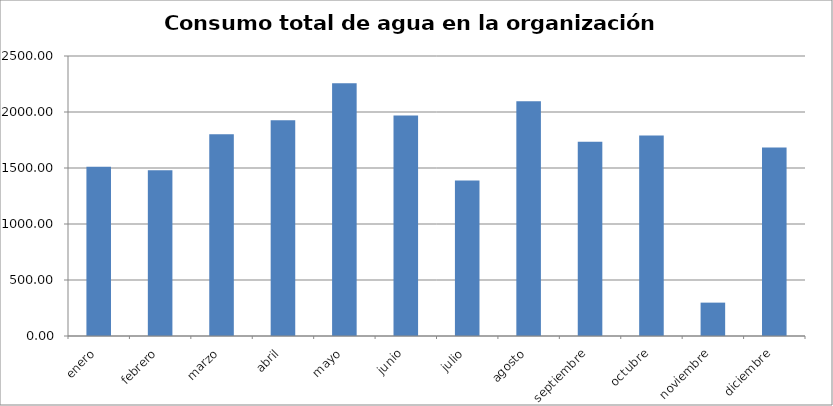
| Category | Series 0 |
|---|---|
| enero | 1511 |
| febrero | 1480 |
| marzo | 1802 |
| abril | 1926 |
| mayo | 2256 |
| junio | 1969 |
| julio | 1389 |
| agosto | 2095 |
| septiembre | 1735 |
| octubre | 1791 |
| noviembre | 298 |
| diciembre | 1682 |